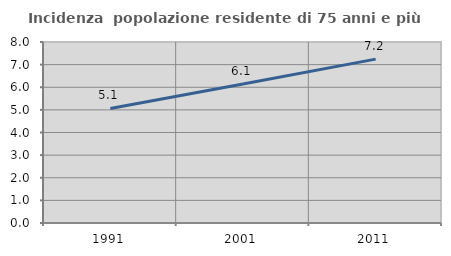
| Category | Incidenza  popolazione residente di 75 anni e più |
|---|---|
| 1991.0 | 5.064 |
| 2001.0 | 6.145 |
| 2011.0 | 7.244 |